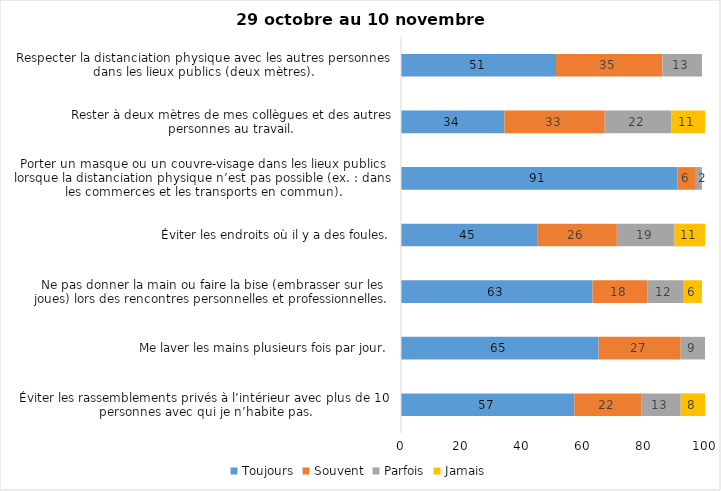
| Category | Toujours | Souvent | Parfois | Jamais |
|---|---|---|---|---|
| Éviter les rassemblements privés à l’intérieur avec plus de 10 personnes avec qui je n’habite pas. | 57 | 22 | 13 | 8 |
| Me laver les mains plusieurs fois par jour. | 65 | 27 | 9 | 0 |
| Ne pas donner la main ou faire la bise (embrasser sur les joues) lors des rencontres personnelles et professionnelles. | 63 | 18 | 12 | 6 |
| Éviter les endroits où il y a des foules. | 45 | 26 | 19 | 11 |
| Porter un masque ou un couvre-visage dans les lieux publics lorsque la distanciation physique n’est pas possible (ex. : dans les commerces et les transports en commun). | 91 | 6 | 2 | 0 |
| Rester à deux mètres de mes collègues et des autres personnes au travail. | 34 | 33 | 22 | 11 |
| Respecter la distanciation physique avec les autres personnes dans les lieux publics (deux mètres). | 51 | 35 | 13 | 0 |